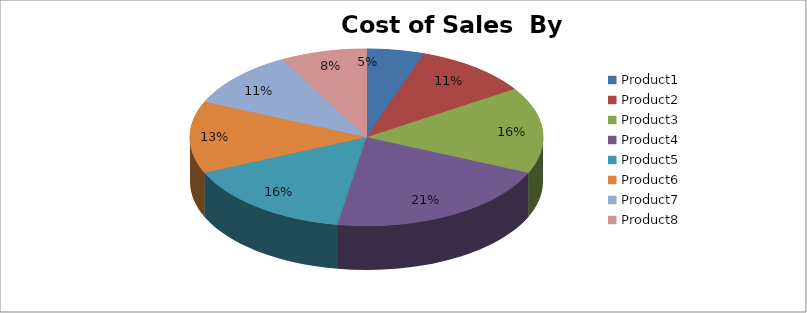
| Category | Cost of Sales |
|---|---|
| Product1 | 2 |
| Product2 | 4 |
| Product3 | 6 |
| Product4 | 8 |
| Product5 | 6 |
| Product6 | 5 |
| Product7 | 4 |
| Product8 | 3 |